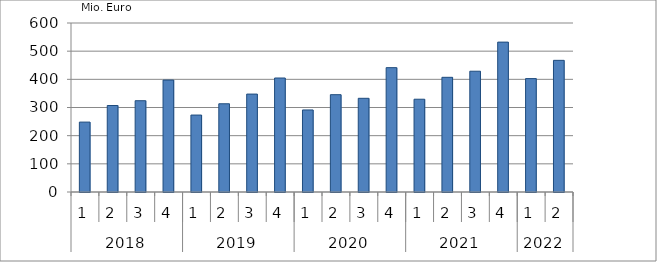
| Category | Ausbaugewerblicher Umsatz3 |
|---|---|
| 0 | 248133.418 |
| 1 | 307099.899 |
| 2 | 324088.989 |
| 3 | 397377.201 |
| 4 | 273159.137 |
| 5 | 313254.251 |
| 6 | 347631.281 |
| 7 | 404721.054 |
| 8 | 291272.144 |
| 9 | 345494.215 |
| 10 | 332629.265 |
| 11 | 441463.36 |
| 12 | 329380.212 |
| 13 | 407164.972 |
| 14 | 428783.222 |
| 15 | 532137.089 |
| 16 | 402625.565 |
| 17 | 467398.849 |